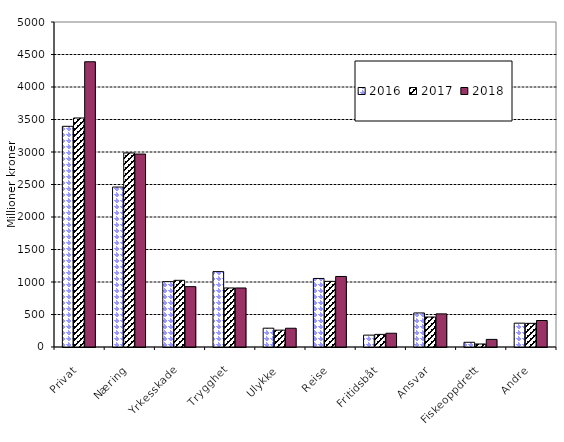
| Category | 2016 | 2017 | 2018 |
|---|---|---|---|
| Privat | 3395.008 | 3523.339 | 4388.265 |
| Næring | 2460.812 | 2985.487 | 2968.497 |
| Yrkesskade | 1005.194 | 1025.826 | 928.785 |
| Trygghet | 1159.859 | 908.118 | 908.027 |
| Ulykke | 289.644 | 259.137 | 288.488 |
| Reise | 1054.352 | 1010.192 | 1085.106 |
| Fritidsbåt | 182.688 | 194.097 | 211.627 |
| Ansvar | 523.92 | 461.433 | 509.757 |
| Fiskeoppdrett | 72.478 | 46.489 | 116.933 |
| Andre | 366.614 | 363.98 | 407.531 |